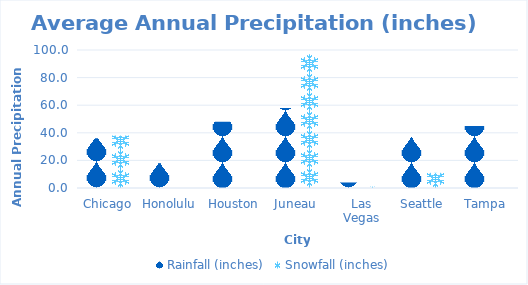
| Category | Rainfall (inches) | Snowfall (inches) |
|---|---|---|
| Chicago | 36 | 38 |
| Honolulu | 18 | 0 |
| Houston | 48 | 0 |
| Juneau | 58 | 97 |
| Las Vegas | 4 | 1 |
| Seattle | 37 | 11 |
| Tampa | 45 | 0 |